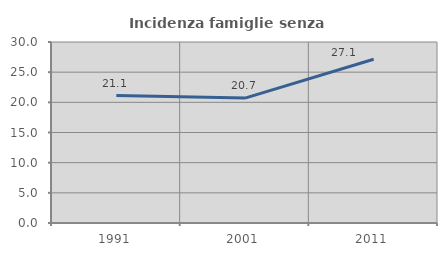
| Category | Incidenza famiglie senza nuclei |
|---|---|
| 1991.0 | 21.132 |
| 2001.0 | 20.698 |
| 2011.0 | 27.14 |